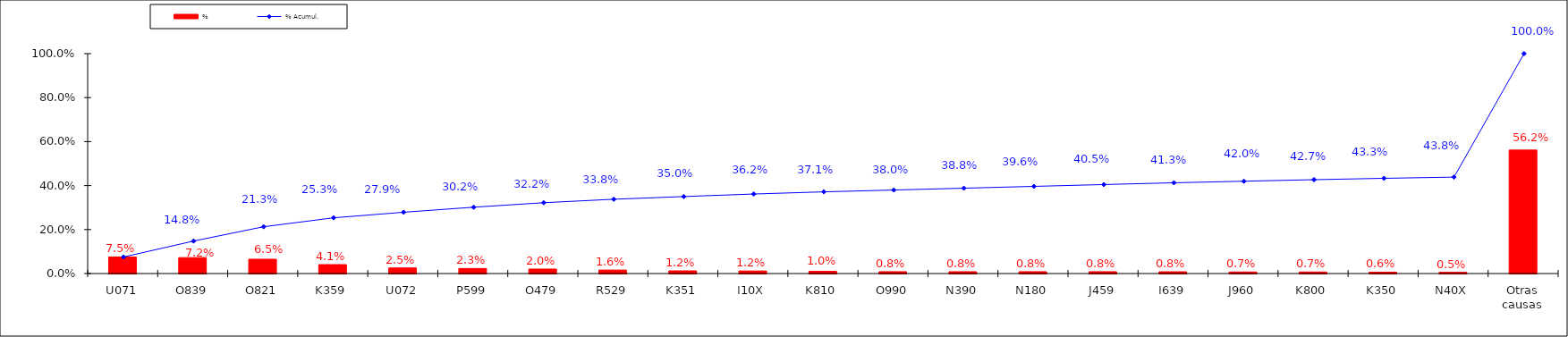
| Category | % |
|---|---|
| U071 | 0.075 |
| O839 | 0.072 |
| O821 | 0.065 |
| K359 | 0.041 |
| U072 | 0.025 |
| P599 | 0.023 |
| O479 | 0.02 |
| R529 | 0.016 |
| K351 | 0.012 |
| I10X | 0.012 |
| K810 | 0.01 |
| O990 | 0.008 |
| N390 | 0.008 |
| N180 | 0.008 |
| J459 | 0.008 |
| I639 | 0.008 |
| J960 | 0.007 |
| K800 | 0.007 |
| K350 | 0.006 |
| N40X | 0.005 |
| Otras causas | 0.562 |